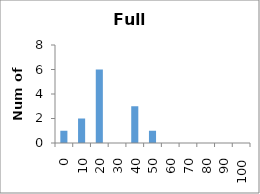
| Category | Frequency |
|---|---|
| 0.0 | 1 |
| 10.0 | 2 |
| 20.0 | 6 |
| 30.0 | 0 |
| 40.0 | 3 |
| 50.0 | 1 |
| 60.0 | 0 |
| 70.0 | 0 |
| 80.0 | 0 |
| 90.0 | 0 |
| 100.0 | 0 |